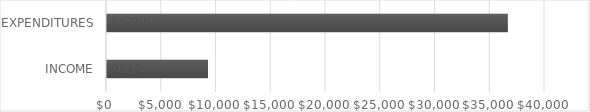
| Category | ANNUAL TOTALS |
|---|---|
| INCOME | 9317 |
| EXPENDITURES | 36700 |